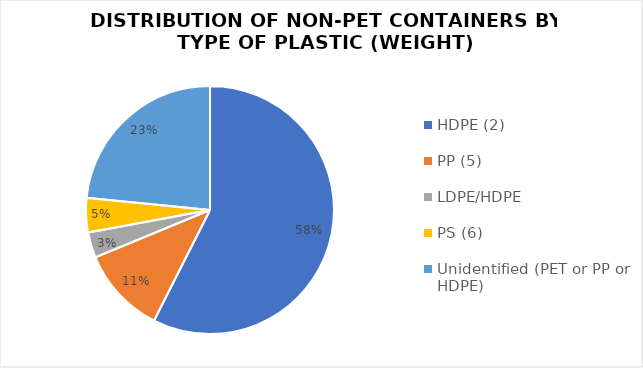
| Category | Series 0 |
|---|---|
| HDPE (2) | 30.99 |
| PP (5) | 6.1 |
| LDPE/HDPE | 1.8 |
| PS (6) | 2.41 |
| Unidentified (PET or PP or HDPE) | 12.64 |